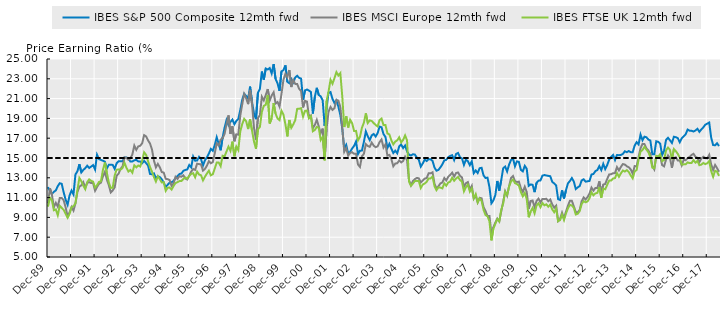
| Category | IBES S&P 500 Composite 12mth fwd | IBES MSCI Europe 12mth fwd | IBES FTSE UK 12mth fwd | Limit |
|---|---|---|---|---|
| 1989-12-31 | 12.055 | 10.416 | 10.088 | 15 |
| 1990-01-31 | 11.688 | 11.946 | 10.986 | 15 |
| 1990-02-28 | 11.368 | 11.293 | 10.738 | 15 |
| 1990-03-30 | 11.577 | 10.025 | 9.724 | 15 |
| 1990-04-30 | 11.729 | 10.471 | 9.806 | 15 |
| 1990-05-31 | 12.157 | 10.086 | 9.217 | 15 |
| 1990-06-29 | 12.451 | 10.957 | 10.169 | 15 |
| 1990-07-31 | 12.39 | 10.968 | 9.963 | 15 |
| 1990-08-31 | 11.526 | 10.725 | 9.756 | 15 |
| 1990-09-28 | 10.79 | 10.01 | 9.368 | 15 |
| 1990-10-31 | 10.276 | 9.107 | 8.966 | 15 |
| 1990-11-30 | 11.227 | 9.503 | 9.351 | 15 |
| 1990-12-31 | 11.717 | 10.049 | 10.025 | 15 |
| 1991-01-31 | 11.318 | 9.69 | 10.139 | 15 |
| 1991-02-28 | 13.339 | 10.422 | 10.422 | 15 |
| 1991-03-29 | 13.658 | 11.562 | 11.766 | 15 |
| 1991-04-30 | 14.37 | 12.104 | 12.984 | 15 |
| 1991-05-31 | 13.541 | 12.238 | 12.653 | 15 |
| 1991-06-28 | 13.789 | 12.557 | 12.206 | 15 |
| 1991-07-31 | 13.972 | 12.008 | 11.849 | 15 |
| 1991-08-30 | 14.223 | 12.476 | 12.573 | 15 |
| 1991-09-30 | 13.993 | 12.561 | 12.841 | 15 |
| 1991-10-31 | 14.131 | 12.467 | 12.697 | 15 |
| 1991-11-29 | 14.281 | 12.464 | 12.612 | 15 |
| 1991-12-31 | 13.835 | 11.691 | 12.002 | 15 |
| 1992-01-31 | 15.331 | 12.079 | 12.25 | 15 |
| 1992-02-28 | 14.888 | 12.397 | 12.58 | 15 |
| 1992-03-31 | 14.805 | 12.507 | 12.645 | 15 |
| 1992-04-30 | 14.725 | 13.14 | 13.789 | 15 |
| 1992-05-29 | 14.625 | 13.591 | 14.54 | 15 |
| 1992-06-30 | 13.949 | 12.829 | 13.508 | 15 |
| 1992-07-31 | 14.312 | 12.259 | 12.52 | 15 |
| 1992-08-31 | 14.329 | 11.52 | 11.975 | 15 |
| 1992-09-30 | 14.301 | 11.728 | 12.001 | 15 |
| 1992-10-30 | 13.908 | 12.038 | 13.243 | 15 |
| 1992-11-30 | 14.472 | 13.204 | 13.824 | 15 |
| 1992-12-31 | 14.676 | 13.427 | 13.83 | 15 |
| 1993-01-29 | 14.66 | 13.906 | 13.82 | 15 |
| 1993-02-26 | 14.663 | 14.151 | 13.995 | 15 |
| 1993-03-31 | 15.047 | 15.058 | 14.515 | 15 |
| 1993-04-30 | 15.056 | 15.016 | 14.006 | 15 |
| 1993-05-31 | 14.93 | 14.819 | 13.632 | 15 |
| 1993-06-30 | 14.641 | 14.975 | 13.792 | 15 |
| 1993-07-30 | 14.654 | 15.354 | 13.514 | 15 |
| 1993-08-31 | 14.769 | 16.252 | 14.264 | 15 |
| 1993-09-30 | 14.808 | 15.824 | 14.056 | 15 |
| 1993-10-29 | 14.66 | 16.171 | 14.246 | 15 |
| 1993-11-30 | 14.649 | 16.234 | 14.14 | 15 |
| 1993-12-31 | 14.471 | 16.488 | 14.734 | 15 |
| 1994-01-31 | 14.716 | 17.308 | 15.573 | 15 |
| 1994-02-28 | 14.491 | 17.178 | 15.322 | 15 |
| 1994-03-31 | 14.243 | 16.778 | 14.683 | 15 |
| 1994-04-29 | 13.389 | 16.463 | 14.094 | 15 |
| 1994-05-31 | 13.353 | 15.874 | 13.622 | 15 |
| 1994-06-30 | 13.444 | 14.74 | 13.072 | 15 |
| 1994-07-29 | 12.957 | 14.055 | 12.623 | 15 |
| 1994-08-31 | 13.152 | 14.399 | 13.159 | 15 |
| 1994-09-30 | 13.072 | 14.065 | 12.856 | 15 |
| 1994-10-31 | 12.852 | 13.578 | 12.523 | 15 |
| 1994-11-30 | 12.509 | 13.524 | 12.563 | 15 |
| 1994-12-30 | 12.074 | 12.897 | 11.682 | 15 |
| 1995-01-31 | 12.297 | 12.864 | 12.001 | 15 |
| 1995-02-28 | 12.507 | 12.768 | 12.014 | 15 |
| 1995-03-31 | 12.548 | 12.185 | 11.81 | 15 |
| 1995-04-28 | 12.681 | 12.443 | 12.175 | 15 |
| 1995-05-31 | 12.969 | 13.101 | 12.461 | 15 |
| 1995-06-30 | 13.168 | 12.881 | 12.56 | 15 |
| 1995-07-31 | 13.385 | 13.172 | 12.669 | 15 |
| 1995-08-31 | 13.428 | 13.106 | 12.676 | 15 |
| 1995-09-29 | 13.705 | 13.251 | 12.88 | 15 |
| 1995-10-31 | 13.792 | 12.931 | 13.029 | 15 |
| 1995-11-30 | 13.844 | 12.824 | 12.899 | 15 |
| 1995-12-29 | 14.294 | 13.216 | 13.209 | 15 |
| 1996-01-31 | 14.056 | 13.626 | 13.401 | 15 |
| 1996-02-29 | 15.146 | 13.891 | 13.464 | 15 |
| 1996-03-29 | 14.729 | 13.799 | 13.05 | 15 |
| 1996-04-30 | 14.745 | 14.422 | 13.624 | 15 |
| 1996-05-31 | 15.119 | 14.388 | 13.333 | 15 |
| 1996-06-28 | 14.887 | 14.353 | 13.258 | 15 |
| 1996-07-31 | 14.233 | 13.726 | 12.738 | 15 |
| 1996-08-30 | 14.773 | 13.899 | 13.105 | 15 |
| 1996-09-30 | 15.069 | 14.225 | 13.433 | 15 |
| 1996-10-31 | 15.45 | 14.684 | 13.713 | 15 |
| 1996-11-29 | 15.916 | 14.47 | 13.248 | 15 |
| 1996-12-31 | 15.723 | 14.586 | 13.361 | 15 |
| 1997-01-31 | 16.319 | 15.478 | 13.937 | 15 |
| 1997-02-28 | 17.091 | 16.471 | 14.541 | 15 |
| 1997-03-31 | 16.435 | 16.264 | 14.547 | 15 |
| 1997-04-30 | 15.782 | 16.86 | 14.176 | 15 |
| 1997-05-30 | 17.09 | 16.995 | 15.233 | 15 |
| 1997-06-30 | 18.059 | 17.434 | 15.168 | 15 |
| 1997-07-31 | 18.837 | 18.411 | 15.664 | 15 |
| 1997-08-29 | 18.327 | 19.305 | 16.148 | 15 |
| 1997-09-30 | 18.647 | 17.435 | 15.723 | 15 |
| 1997-10-31 | 18.882 | 18.202 | 16.654 | 15 |
| 1997-11-28 | 18.412 | 16.69 | 15.171 | 15 |
| 1997-12-31 | 18.742 | 17.391 | 16.155 | 15 |
| 1998-01-30 | 18.94 | 17.358 | 15.8 | 15 |
| 1998-02-27 | 19.84 | 19.282 | 17.68 | 15 |
| 1998-03-31 | 20.885 | 20.418 | 18.432 | 15 |
| 1998-04-30 | 21.482 | 21.469 | 18.951 | 15 |
| 1998-05-29 | 21.276 | 21.038 | 18.72 | 15 |
| 1998-06-30 | 20.993 | 20.441 | 17.923 | 15 |
| 1998-07-31 | 22.211 | 21.874 | 18.901 | 15 |
| 1998-08-31 | 20.647 | 20.448 | 17.773 | 15 |
| 1998-09-30 | 19.487 | 18.034 | 16.663 | 15 |
| 1998-10-30 | 18.925 | 16.834 | 15.93 | 15 |
| 1998-11-30 | 21.577 | 19.043 | 17.895 | 15 |
| 1998-12-31 | 21.974 | 19.322 | 18.133 | 15 |
| 1999-01-29 | 23.736 | 21.188 | 19.657 | 15 |
| 1999-02-26 | 22.92 | 20.821 | 20.269 | 15 |
| 1999-03-31 | 24.043 | 21.362 | 20.376 | 15 |
| 1999-04-30 | 23.941 | 21.964 | 21.346 | 15 |
| 1999-05-31 | 24.086 | 20.808 | 18.483 | 15 |
| 1999-06-30 | 23.545 | 21.31 | 19.006 | 15 |
| 1999-07-30 | 24.49 | 21.633 | 20.547 | 15 |
| 1999-08-31 | 22.985 | 20.507 | 19.474 | 15 |
| 1999-09-30 | 22.537 | 20.652 | 18.994 | 15 |
| 1999-10-29 | 21.779 | 20.192 | 18.823 | 15 |
| 1999-11-30 | 23.745 | 21.464 | 19.77 | 15 |
| 1999-12-31 | 23.876 | 22.902 | 19.382 | 15 |
| 2000-01-31 | 24.354 | 23.496 | 18.421 | 15 |
| 2000-02-29 | 22.699 | 23.159 | 17.183 | 15 |
| 2000-03-31 | 22.556 | 23.885 | 18.842 | 15 |
| 2000-04-28 | 22.982 | 22.167 | 18.046 | 15 |
| 2000-05-31 | 22.628 | 22.884 | 18.389 | 15 |
| 2000-06-30 | 23.125 | 22.486 | 18.808 | 15 |
| 2000-07-31 | 23.305 | 22.475 | 19.961 | 15 |
| 2000-08-31 | 23.091 | 21.986 | 19.974 | 15 |
| 2000-09-29 | 23.02 | 21.757 | 20.031 | 15 |
| 2000-10-31 | 20.868 | 20.107 | 19.18 | 15 |
| 2000-11-30 | 21.829 | 20.778 | 19.761 | 15 |
| 2000-12-29 | 21.919 | 20.694 | 19.794 | 15 |
| 2001-01-31 | 21.812 | 19.2 | 19.013 | 15 |
| 2001-02-28 | 21.668 | 19.302 | 19.219 | 15 |
| 2001-03-30 | 19.495 | 18.016 | 17.704 | 15 |
| 2001-04-30 | 21.179 | 18.332 | 17.83 | 15 |
| 2001-05-31 | 22.089 | 18.852 | 18.141 | 15 |
| 2001-06-29 | 21.364 | 18.198 | 18.053 | 15 |
| 2001-07-31 | 21.229 | 17.507 | 16.819 | 15 |
| 2001-08-31 | 20.824 | 17.971 | 17.112 | 15 |
| 2001-09-28 | 18.239 | 14.84 | 14.758 | 15 |
| 2001-10-31 | 20.125 | 17.992 | 20.759 | 15 |
| 2001-11-30 | 21.585 | 19.669 | 21.713 | 15 |
| 2001-12-31 | 21.664 | 20.157 | 22.908 | 15 |
| 2002-01-31 | 20.971 | 19.858 | 22.498 | 15 |
| 2002-02-28 | 20.552 | 20.026 | 23.066 | 15 |
| 2002-03-29 | 20.825 | 20.868 | 23.675 | 15 |
| 2002-04-30 | 20.185 | 20.792 | 23.334 | 15 |
| 2002-05-31 | 19.35 | 20.156 | 23.572 | 15 |
| 2002-06-28 | 17.951 | 18.027 | 21.183 | 15 |
| 2002-07-31 | 15.931 | 15.626 | 18.129 | 15 |
| 2002-08-30 | 16.322 | 15.992 | 19.229 | 15 |
| 2002-09-30 | 15.444 | 15.246 | 18.086 | 15 |
| 2002-10-31 | 15.625 | 15.512 | 18.857 | 15 |
| 2002-11-29 | 15.958 | 15.583 | 18.525 | 15 |
| 2002-12-31 | 16.219 | 15.42 | 17.731 | 15 |
| 2003-01-31 | 16.666 | 15.434 | 17.739 | 15 |
| 2003-02-28 | 15.392 | 14.339 | 16.78 | 15 |
| 2003-03-31 | 15.739 | 14.097 | 17.129 | 15 |
| 2003-04-30 | 15.747 | 15.172 | 18.052 | 15 |
| 2003-05-30 | 16.626 | 15.415 | 18.565 | 15 |
| 2003-06-30 | 17.688 | 16.402 | 19.515 | 15 |
| 2003-07-31 | 17.184 | 16.212 | 18.537 | 15 |
| 2003-08-29 | 16.802 | 16.129 | 18.798 | 15 |
| 2003-09-30 | 17.287 | 16.555 | 18.737 | 15 |
| 2003-10-31 | 17.424 | 16.247 | 18.529 | 15 |
| 2003-11-28 | 17.166 | 16.092 | 18.338 | 15 |
| 2003-12-31 | 17.514 | 16.181 | 18.186 | 15 |
| 2004-01-30 | 18.167 | 16.601 | 18.828 | 15 |
| 2004-02-27 | 18.108 | 16.87 | 18.983 | 15 |
| 2004-03-31 | 17.415 | 16.058 | 18.324 | 15 |
| 2004-04-30 | 17.127 | 16.371 | 18.331 | 15 |
| 2004-05-31 | 16.015 | 15.241 | 17.477 | 15 |
| 2004-06-30 | 16.43 | 15.314 | 17.375 | 15 |
| 2004-07-30 | 15.948 | 14.89 | 16.787 | 15 |
| 2004-08-31 | 15.503 | 14.164 | 16.378 | 15 |
| 2004-09-30 | 15.742 | 14.438 | 16.658 | 15 |
| 2004-10-29 | 15.478 | 14.47 | 16.783 | 15 |
| 2004-11-30 | 16.174 | 14.743 | 17.091 | 15 |
| 2004-12-31 | 16.365 | 14.552 | 16.578 | 15 |
| 2005-01-31 | 16.002 | 14.7 | 16.826 | 15 |
| 2005-02-28 | 16.258 | 15.139 | 17.281 | 15 |
| 2005-03-31 | 15.668 | 14.789 | 16.786 | 15 |
| 2005-04-29 | 15.326 | 12.746 | 12.617 | 15 |
| 2005-05-31 | 15.253 | 12.241 | 12.197 | 15 |
| 2005-06-30 | 15.381 | 12.678 | 12.421 | 15 |
| 2005-07-29 | 15.346 | 12.871 | 12.68 | 15 |
| 2005-08-31 | 15.038 | 12.988 | 12.69 | 15 |
| 2005-09-30 | 14.813 | 12.949 | 12.671 | 15 |
| 2005-10-31 | 14.13 | 12.526 | 11.969 | 15 |
| 2005-11-30 | 14.448 | 12.717 | 12.313 | 15 |
| 2005-12-30 | 14.847 | 12.919 | 12.426 | 15 |
| 2006-01-31 | 14.691 | 12.976 | 12.59 | 15 |
| 2006-02-28 | 14.885 | 13.448 | 12.935 | 15 |
| 2006-03-31 | 14.868 | 13.451 | 12.931 | 15 |
| 2006-04-28 | 14.705 | 13.556 | 13.132 | 15 |
| 2006-05-31 | 14.029 | 12.393 | 12.154 | 15 |
| 2006-06-30 | 13.719 | 11.912 | 11.754 | 15 |
| 2006-07-31 | 13.799 | 12.139 | 12.042 | 15 |
| 2006-08-31 | 14.057 | 12.434 | 12.008 | 15 |
| 2006-09-29 | 14.357 | 12.526 | 11.931 | 15 |
| 2006-10-31 | 14.759 | 12.979 | 12.438 | 15 |
| 2006-11-30 | 14.818 | 12.738 | 12.199 | 15 |
| 2006-12-29 | 15.08 | 13.105 | 12.531 | 15 |
| 2007-01-31 | 15.209 | 13.292 | 12.606 | 15 |
| 2007-02-28 | 15.284 | 13.517 | 13.01 | 15 |
| 2007-03-30 | 14.797 | 13.117 | 12.698 | 15 |
| 2007-04-30 | 15.403 | 13.483 | 12.934 | 15 |
| 2007-05-31 | 15.508 | 13.539 | 13.087 | 15 |
| 2007-06-29 | 15.071 | 13.193 | 12.778 | 15 |
| 2007-07-31 | 14.955 | 13.039 | 12.615 | 15 |
| 2007-08-31 | 14.302 | 12.088 | 11.631 | 15 |
| 2007-09-28 | 14.826 | 12.45 | 12.052 | 15 |
| 2007-10-31 | 14.686 | 12.567 | 12.307 | 15 |
| 2007-11-30 | 14.278 | 11.821 | 11.608 | 15 |
| 2007-12-31 | 14.669 | 12.188 | 11.935 | 15 |
| 2008-01-31 | 13.47 | 10.907 | 10.928 | 15 |
| 2008-02-29 | 13.74 | 11.214 | 11.344 | 15 |
| 2008-03-31 | 13.482 | 10.513 | 10.514 | 15 |
| 2008-04-30 | 13.97 | 10.973 | 10.915 | 15 |
| 2008-05-30 | 14.01 | 10.934 | 10.662 | 15 |
| 2008-06-30 | 13.235 | 10.026 | 9.759 | 15 |
| 2008-07-31 | 12.978 | 9.642 | 9.236 | 15 |
| 2008-08-29 | 13.016 | 9.141 | 9.13 | 15 |
| 2008-09-30 | 12.059 | 9.137 | 8.6 | 15 |
| 2008-10-31 | 10.428 | 7.369 | 6.682 | 15 |
| 2008-11-28 | 10.715 | 7.986 | 7.851 | 15 |
| 2008-12-31 | 11.26 | 8.491 | 8.357 | 15 |
| 2009-01-30 | 12.678 | 8.874 | 8.823 | 15 |
| 2009-02-27 | 11.703 | 8.591 | 8.603 | 15 |
| 2009-03-31 | 12.75 | 9.616 | 9.753 | 15 |
| 2009-04-30 | 13.963 | 10.577 | 10.404 | 15 |
| 2009-05-29 | 14.131 | 11.643 | 11.569 | 15 |
| 2009-06-30 | 13.637 | 11.192 | 11.266 | 15 |
| 2009-07-31 | 14.328 | 12.144 | 12.113 | 15 |
| 2009-08-31 | 14.804 | 12.978 | 12.638 | 15 |
| 2009-09-30 | 14.963 | 13.178 | 12.835 | 15 |
| 2009-10-30 | 14.16 | 12.661 | 12.462 | 15 |
| 2009-11-30 | 14.654 | 12.577 | 12.371 | 15 |
| 2009-12-31 | 14.616 | 12.612 | 12.209 | 15 |
| 2010-01-29 | 13.808 | 11.955 | 11.575 | 15 |
| 2010-02-26 | 13.651 | 11.568 | 11.126 | 15 |
| 2010-03-31 | 14.205 | 12.099 | 11.471 | 15 |
| 2010-04-30 | 13.905 | 11.562 | 10.854 | 15 |
| 2010-05-31 | 12.188 | 9.856 | 9.015 | 15 |
| 2010-06-30 | 12.326 | 10.66 | 9.596 | 15 |
| 2010-07-30 | 12.292 | 10.705 | 9.956 | 15 |
| 2010-08-31 | 11.553 | 10.032 | 9.403 | 15 |
| 2010-09-30 | 12.485 | 10.662 | 10.206 | 15 |
| 2010-10-29 | 12.709 | 10.897 | 10.423 | 15 |
| 2010-11-30 | 12.734 | 10.509 | 10.024 | 15 |
| 2010-12-31 | 13.218 | 10.868 | 10.459 | 15 |
| 2011-01-31 | 13.279 | 10.852 | 10.222 | 15 |
| 2011-02-28 | 13.232 | 10.882 | 10.32 | 15 |
| 2011-03-31 | 13.197 | 10.632 | 10.078 | 15 |
| 2011-04-29 | 13.155 | 10.811 | 10.294 | 15 |
| 2011-05-31 | 12.594 | 10.317 | 9.806 | 15 |
| 2011-06-30 | 12.427 | 9.984 | 9.521 | 15 |
| 2011-07-29 | 12.22 | 10.18 | 9.905 | 15 |
| 2011-08-31 | 10.838 | 8.628 | 8.617 | 15 |
| 2011-09-30 | 10.76 | 8.846 | 8.734 | 15 |
| 2011-10-31 | 11.737 | 9.473 | 9.286 | 15 |
| 2011-11-30 | 10.911 | 8.905 | 8.737 | 15 |
| 2011-12-30 | 11.739 | 9.596 | 9.396 | 15 |
| 2012-01-31 | 12.438 | 10.172 | 9.915 | 15 |
| 2012-02-29 | 12.673 | 10.676 | 10.27 | 15 |
| 2012-03-30 | 12.975 | 10.678 | 10.202 | 15 |
| 2012-04-30 | 12.619 | 10.11 | 9.966 | 15 |
| 2012-05-31 | 11.868 | 9.543 | 9.297 | 15 |
| 2012-06-29 | 12.032 | 9.494 | 9.367 | 15 |
| 2012-07-31 | 12.17 | 9.773 | 9.64 | 15 |
| 2012-08-31 | 12.735 | 10.63 | 10.342 | 15 |
| 2012-09-28 | 12.849 | 11.015 | 10.645 | 15 |
| 2012-10-31 | 12.614 | 10.803 | 10.526 | 15 |
| 2012-11-30 | 12.645 | 11.061 | 10.616 | 15 |
| 2012-12-31 | 12.683 | 11.406 | 10.936 | 15 |
| 2013-01-31 | 13.331 | 12.012 | 11.541 | 15 |
| 2013-02-28 | 13.387 | 11.704 | 11.228 | 15 |
| 2013-03-29 | 13.681 | 11.977 | 11.422 | 15 |
| 2013-04-30 | 13.775 | 11.978 | 11.481 | 15 |
| 2013-05-31 | 14.174 | 12.638 | 12.056 | 15 |
| 2013-06-28 | 13.781 | 11.482 | 10.996 | 15 |
| 2013-07-31 | 14.399 | 12.316 | 11.905 | 15 |
| 2013-08-30 | 13.877 | 12.377 | 11.837 | 15 |
| 2013-09-30 | 14.284 | 12.881 | 12.288 | 15 |
| 2013-10-31 | 14.824 | 13.331 | 12.715 | 15 |
| 2013-11-29 | 15.117 | 13.367 | 12.719 | 15 |
| 2013-12-31 | 15.314 | 13.457 | 12.931 | 15 |
| 2014-01-31 | 14.791 | 13.478 | 12.972 | 15 |
| 2014-02-28 | 15.307 | 14.079 | 13.471 | 15 |
| 2014-03-31 | 15.286 | 13.743 | 13.1 | 15 |
| 2014-04-30 | 15.306 | 14.106 | 13.454 | 15 |
| 2014-05-30 | 15.411 | 14.387 | 13.74 | 15 |
| 2014-06-30 | 15.68 | 14.341 | 13.632 | 15 |
| 2014-07-31 | 15.586 | 14.169 | 13.775 | 15 |
| 2014-08-29 | 15.702 | 14.067 | 13.592 | 15 |
| 2014-09-30 | 15.589 | 13.848 | 13.24 | 15 |
| 2014-10-31 | 15.588 | 13.412 | 12.945 | 15 |
| 2014-11-28 | 16.254 | 14.184 | 13.649 | 15 |
| 2014-12-31 | 16.6 | 14.153 | 13.78 | 15 |
| 2015-01-30 | 16.371 | 15.095 | 14.833 | 15 |
| 2015-02-27 | 17.368 | 15.983 | 15.646 | 15 |
| 2015-03-31 | 16.79 | 16.426 | 15.805 | 15 |
| 2015-04-30 | 17.154 | 16.406 | 16.132 | 15 |
| 2015-05-29 | 17.093 | 15.971 | 15.845 | 15 |
| 2015-06-30 | 16.864 | 15.754 | 15.595 | 15 |
| 2015-07-31 | 16.759 | 15.429 | 15.078 | 15 |
| 2015-08-31 | 15.381 | 14.189 | 14.03 | 15 |
| 2015-09-30 | 15.374 | 13.852 | 13.957 | 15 |
| 2015-10-30 | 16.688 | 15.125 | 15.216 | 15 |
| 2015-11-30 | 16.634 | 15.191 | 15.132 | 15 |
| 2015-12-31 | 16.457 | 15.205 | 15.386 | 15 |
| 2016-01-29 | 15.293 | 14.292 | 14.679 | 15 |
| 2016-02-29 | 15.726 | 14.156 | 14.802 | 15 |
| 2016-03-31 | 16.829 | 14.84 | 15.779 | 15 |
| 2016-04-29 | 17.04 | 15.262 | 16.052 | 15 |
| 2016-05-31 | 16.794 | 14.98 | 15.817 | 15 |
| 2016-06-30 | 16.52 | 14.014 | 14.875 | 15 |
| 2016-07-29 | 17.147 | 15.008 | 15.903 | 15 |
| 2016-08-31 | 17.099 | 15.071 | 15.686 | 15 |
| 2016-09-30 | 16.999 | 14.744 | 15.409 | 15 |
| 2016-10-31 | 16.592 | 14.753 | 15.048 | 15 |
| 2016-11-30 | 16.994 | 14.255 | 14.34 | 15 |
| 2016-12-30 | 17.184 | 14.827 | 14.356 | 15 |
| 2017-01-31 | 17.398 | 14.779 | 14.359 | 15 |
| 2017-02-28 | 17.875 | 14.991 | 14.553 | 15 |
| 2017-03-31 | 17.76 | 15.112 | 14.489 | 15 |
| 2017-04-28 | 17.748 | 15.307 | 14.497 | 15 |
| 2017-05-31 | 17.678 | 15.421 | 14.785 | 15 |
| 2017-06-30 | 17.783 | 15.125 | 14.529 | 15 |
| 2017-07-31 | 17.95 | 15.011 | 14.702 | 15 |
| 2017-08-31 | 17.642 | 14.592 | 14.273 | 15 |
| 2017-09-29 | 17.893 | 14.946 | 14.333 | 15 |
| 2017-10-31 | 18.095 | 15.124 | 14.498 | 15 |
| 2017-11-30 | 18.362 | 14.989 | 14.382 | 15 |
| 2017-12-29 | 18.47 | 14.959 | 14.471 | 15 |
| 2018-01-31 | 18.58 | 15.317 | 14.683 | 15 |
| 2018-02-28 | 17.06 | 14.349 | 13.679 | 15 |
| 2018-03-30 | 16.308 | 13.791 | 13.106 | 15 |
| 2018-04-30 | 16.283 | 14.298 | 13.712 | 15 |
| 2018-05-31 | 16.487 | 13.978 | 13.617 | 15 |
| 2018-06-29 | 16.204 | 13.606 | 13.19 | 15 |